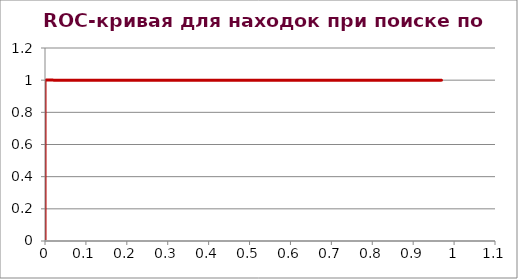
| Category | Series 0 |
|---|---|
| 0.0 | 0.006 |
| 0.0 | 0.012 |
| 0.0 | 0.019 |
| 0.0 | 0.025 |
| 0.0 | 0.031 |
| 0.0 | 0.038 |
| 0.0 | 0.044 |
| 0.0 | 0.05 |
| 0.0 | 0.056 |
| 0.0 | 0.062 |
| 0.0 | 0.069 |
| 0.0 | 0.075 |
| 0.0 | 0.081 |
| 0.0 | 0.088 |
| 0.0 | 0.094 |
| 0.0 | 0.1 |
| 0.0 | 0.106 |
| 0.0 | 0.112 |
| 0.0 | 0.119 |
| 0.0 | 0.125 |
| 0.0 | 0.131 |
| 0.0 | 0.138 |
| 0.0 | 0.144 |
| 0.0 | 0.15 |
| 0.0 | 0.156 |
| 0.0 | 0.162 |
| 0.0 | 0.169 |
| 0.0 | 0.175 |
| 0.0 | 0.181 |
| 0.0 | 0.188 |
| 0.0 | 0.194 |
| 0.0 | 0.2 |
| 0.0 | 0.206 |
| 0.0 | 0.212 |
| 0.0 | 0.219 |
| 0.0 | 0.225 |
| 0.0 | 0.231 |
| 0.0 | 0.238 |
| 0.0 | 0.244 |
| 0.0 | 0.25 |
| 0.0 | 0.256 |
| 0.0 | 0.262 |
| 0.0 | 0.269 |
| 0.0 | 0.275 |
| 0.0 | 0.281 |
| 0.0 | 0.288 |
| 0.0 | 0.294 |
| 0.0 | 0.3 |
| 0.0 | 0.306 |
| 0.0 | 0.312 |
| 0.0 | 0.319 |
| 0.0 | 0.325 |
| 0.0 | 0.331 |
| 0.0 | 0.338 |
| 0.0 | 0.344 |
| 0.0 | 0.35 |
| 0.0 | 0.356 |
| 0.0 | 0.362 |
| 0.0 | 0.369 |
| 0.0 | 0.375 |
| 0.0 | 0.381 |
| 0.0 | 0.388 |
| 0.0 | 0.394 |
| 0.0 | 0.4 |
| 0.0 | 0.406 |
| 0.0 | 0.412 |
| 0.0 | 0.419 |
| 0.0 | 0.425 |
| 0.0 | 0.431 |
| 0.0 | 0.438 |
| 0.0 | 0.444 |
| 0.0 | 0.45 |
| 0.0 | 0.456 |
| 0.0 | 0.462 |
| 0.0 | 0.469 |
| 0.0 | 0.475 |
| 0.0 | 0.481 |
| 0.0 | 0.488 |
| 0.0 | 0.494 |
| 0.0 | 0.5 |
| 0.0 | 0.506 |
| 0.0 | 0.512 |
| 0.0 | 0.519 |
| 0.0 | 0.525 |
| 0.0 | 0.531 |
| 0.0 | 0.538 |
| 0.0 | 0.544 |
| 0.0 | 0.55 |
| 0.0 | 0.556 |
| 0.0 | 0.562 |
| 0.0 | 0.569 |
| 0.0 | 0.575 |
| 0.0 | 0.581 |
| 0.0 | 0.588 |
| 0.0 | 0.594 |
| 0.0 | 0.6 |
| 0.0 | 0.606 |
| 0.0 | 0.612 |
| 0.0 | 0.619 |
| 0.0 | 0.625 |
| 0.0 | 0.631 |
| 0.0 | 0.638 |
| 0.0 | 0.644 |
| 0.0 | 0.65 |
| 0.0 | 0.656 |
| 0.0 | 0.662 |
| 0.0 | 0.669 |
| 0.0 | 0.675 |
| 0.0 | 0.681 |
| 0.0 | 0.688 |
| 0.0 | 0.694 |
| 0.0 | 0.7 |
| 0.0 | 0.706 |
| 0.0 | 0.712 |
| 0.0 | 0.719 |
| 0.0 | 0.725 |
| 0.0 | 0.731 |
| 0.0 | 0.738 |
| 0.0 | 0.744 |
| 0.0 | 0.75 |
| 0.0 | 0.756 |
| 0.0 | 0.762 |
| 0.0 | 0.769 |
| 0.0 | 0.775 |
| 0.0 | 0.781 |
| 0.0 | 0.788 |
| 0.0 | 0.794 |
| 0.0 | 0.8 |
| 0.0 | 0.806 |
| 0.0 | 0.812 |
| 0.0 | 0.819 |
| 0.0 | 0.825 |
| 0.0 | 0.831 |
| 0.0 | 0.838 |
| 0.0 | 0.844 |
| 0.0 | 0.85 |
| 0.0 | 0.856 |
| 0.0 | 0.862 |
| 0.0 | 0.869 |
| 0.0 | 0.875 |
| 0.0 | 0.881 |
| 0.0 | 0.888 |
| 0.0 | 0.894 |
| 0.0 | 0.9 |
| 0.0 | 0.906 |
| 0.0 | 0.912 |
| 0.0 | 0.919 |
| 0.0 | 0.925 |
| 0.0 | 0.931 |
| 0.0 | 0.938 |
| 0.0 | 0.944 |
| 0.0 | 0.95 |
| 0.0 | 0.956 |
| 0.0 | 0.962 |
| 0.0 | 0.969 |
| 0.0 | 0.975 |
| 0.0 | 0.981 |
| 0.0 | 0.988 |
| 0.0 | 0.994 |
| 0.0 | 1 |
| 0.033333333333333326 | 1 |
| 0.06666666666666665 | 1 |
| 0.09999999999999998 | 1 |
| 0.1333333333333333 | 1 |
| 0.16666666666666663 | 1 |
| 0.19999999999999996 | 1 |
| 0.23333333333333328 | 1 |
| 0.2666666666666667 | 1 |
| 0.30000000000000004 | 1 |
| 0.33333333333333337 | 1 |
| 0.3666666666666667 | 1 |
| 0.4 | 1 |
| 0.43333333333333335 | 1 |
| 0.4666666666666667 | 1 |
| 0.5 | 1 |
| 0.5333333333333333 | 1 |
| 0.5666666666666667 | 1 |
| 0.6 | 1 |
| 0.6333333333333333 | 1 |
| 0.6666666666666667 | 1 |
| 0.7 | 1 |
| 0.7333333333333334 | 1 |
| 0.7666666666666666 | 1 |
| 0.8 | 1 |
| 0.8333333333333334 | 1 |
| 0.8666666666666667 | 1 |
| 0.9 | 1 |
| 0.9333333333333333 | 1 |
| 0.9666666666666667 | 1 |
| 0.9666666666666667 | 1 |